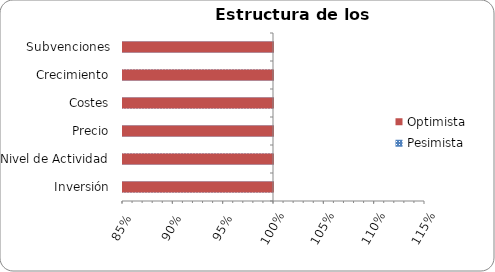
| Category | Pesimista | Optimista |
|---|---|---|
| Inversión | 0 | 0 |
| Nivel de Actividad | 0 | 0 |
| Precio | 0 | 0 |
| Costes | 0 | 0 |
| Crecimiento | 0 | 0 |
| Subvenciones | 0 | 0 |